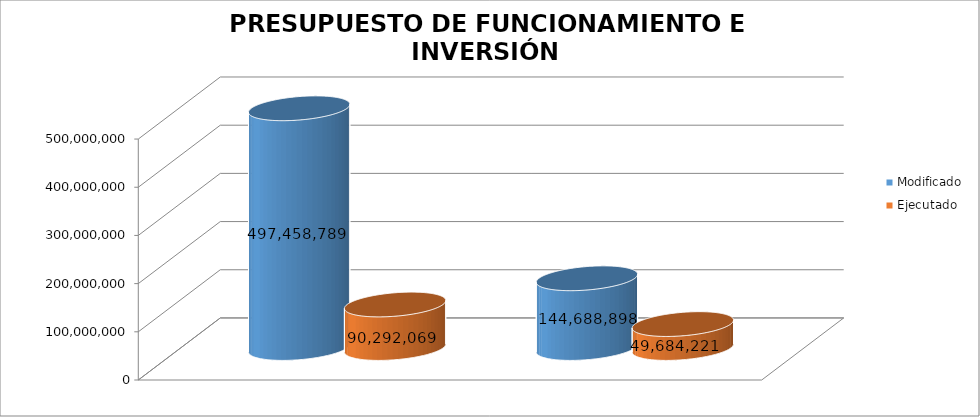
| Category | Modificado | Ejecutado | Series 2 |
|---|---|---|---|
| 0 | 144688898 | 49684220.83 |  |